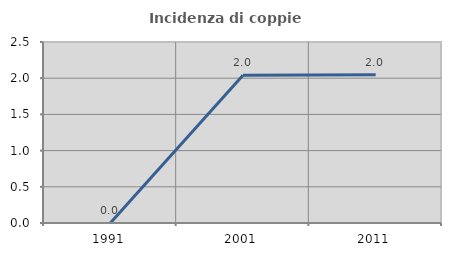
| Category | Incidenza di coppie miste |
|---|---|
| 1991.0 | 0 |
| 2001.0 | 2.041 |
| 2011.0 | 2.048 |